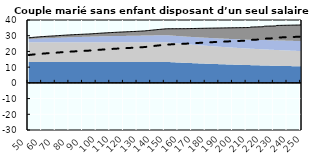
| Category | Coin fiscal moyen (somme des composantes) | Taux moyen d'imposition net en % du salaire brut |
|---|---|---|
| 50.0 | 28.675 | 17.719 |
| 51.0 | 28.762 | 17.82 |
| 52.0 | 28.845 | 17.916 |
| 53.0 | 28.926 | 18.009 |
| 54.0 | 29.004 | 18.098 |
| 55.0 | 29.078 | 18.185 |
| 56.0 | 29.15 | 18.268 |
| 57.0 | 29.22 | 18.348 |
| 58.0 | 29.287 | 18.426 |
| 59.0 | 29.352 | 18.5 |
| 60.0 | 29.415 | 18.573 |
| 61.0 | 29.475 | 18.643 |
| 62.0 | 29.534 | 18.71 |
| 63.0 | 29.591 | 18.776 |
| 64.0 | 29.646 | 18.839 |
| 65.0 | 29.699 | 18.901 |
| 66.0 | 29.751 | 18.961 |
| 67.0 | 29.801 | 19.019 |
| 68.0 | 29.85 | 19.075 |
| 69.0 | 29.897 | 19.129 |
| 70.0 | 29.946 | 19.186 |
| 71.0 | 30.009 | 19.258 |
| 72.0 | 30.07 | 19.329 |
| 73.0 | 30.13 | 19.398 |
| 74.0 | 30.188 | 19.465 |
| 75.0 | 30.245 | 19.53 |
| 76.0 | 30.3 | 19.594 |
| 77.0 | 30.353 | 19.655 |
| 78.0 | 30.405 | 19.716 |
| 79.0 | 30.456 | 19.774 |
| 80.0 | 30.506 | 19.831 |
| 81.0 | 30.554 | 19.887 |
| 82.0 | 30.601 | 19.942 |
| 83.0 | 30.647 | 19.995 |
| 84.0 | 30.692 | 20.047 |
| 85.0 | 30.736 | 20.097 |
| 86.0 | 30.779 | 20.147 |
| 87.0 | 30.821 | 20.195 |
| 88.0 | 30.862 | 20.242 |
| 89.0 | 30.902 | 20.288 |
| 90.0 | 30.941 | 20.334 |
| 91.0 | 30.979 | 20.378 |
| 92.0 | 31.017 | 20.421 |
| 93.0 | 31.053 | 20.463 |
| 94.0 | 31.089 | 20.505 |
| 95.0 | 31.133 | 20.555 |
| 96.0 | 31.197 | 20.629 |
| 97.0 | 31.26 | 20.701 |
| 98.0 | 31.322 | 20.773 |
| 99.0 | 31.382 | 20.843 |
| 100.0 | 31.442 | 20.911 |
| 101.0 | 31.5 | 20.978 |
| 102.0 | 31.557 | 21.044 |
| 103.0 | 31.613 | 21.109 |
| 104.0 | 31.668 | 21.172 |
| 105.0 | 31.722 | 21.234 |
| 106.0 | 31.775 | 21.295 |
| 107.0 | 31.827 | 21.355 |
| 108.0 | 31.877 | 21.414 |
| 109.0 | 31.927 | 21.471 |
| 110.0 | 31.977 | 21.528 |
| 111.0 | 32.025 | 21.584 |
| 112.0 | 32.072 | 21.638 |
| 113.0 | 32.118 | 21.692 |
| 114.0 | 32.164 | 21.745 |
| 115.0 | 32.209 | 21.796 |
| 116.0 | 32.253 | 21.847 |
| 117.0 | 32.296 | 21.897 |
| 118.0 | 32.339 | 21.946 |
| 119.0 | 32.381 | 21.995 |
| 120.0 | 32.422 | 22.042 |
| 121.0 | 32.463 | 22.089 |
| 122.0 | 32.503 | 22.135 |
| 123.0 | 32.542 | 22.18 |
| 124.0 | 32.58 | 22.225 |
| 125.0 | 32.618 | 22.268 |
| 126.0 | 32.656 | 22.312 |
| 127.0 | 32.692 | 22.354 |
| 128.0 | 32.729 | 22.396 |
| 129.0 | 32.777 | 22.452 |
| 130.0 | 32.825 | 22.507 |
| 131.0 | 32.873 | 22.563 |
| 132.0 | 32.92 | 22.617 |
| 133.0 | 32.966 | 22.67 |
| 134.0 | 33.012 | 22.723 |
| 135.0 | 33.057 | 22.775 |
| 136.0 | 33.146 | 22.878 |
| 137.0 | 33.238 | 22.984 |
| 138.0 | 33.329 | 23.088 |
| 139.0 | 33.419 | 23.192 |
| 140.0 | 33.507 | 23.293 |
| 141.0 | 33.594 | 23.394 |
| 142.0 | 33.679 | 23.493 |
| 143.0 | 33.764 | 23.59 |
| 144.0 | 33.847 | 23.686 |
| 145.0 | 33.929 | 23.781 |
| 146.0 | 34.01 | 23.874 |
| 147.0 | 34.09 | 23.967 |
| 148.0 | 34.169 | 24.058 |
| 149.0 | 34.247 | 24.147 |
| 150.0 | 34.324 | 24.236 |
| 151.0 | 34.4 | 24.323 |
| 152.0 | 34.428 | 24.382 |
| 153.0 | 34.432 | 24.426 |
| 154.0 | 34.436 | 24.469 |
| 155.0 | 34.44 | 24.511 |
| 156.0 | 34.444 | 24.553 |
| 157.0 | 34.447 | 24.595 |
| 158.0 | 34.451 | 24.636 |
| 159.0 | 34.455 | 24.676 |
| 160.0 | 34.459 | 24.716 |
| 161.0 | 34.462 | 24.756 |
| 162.0 | 34.466 | 24.794 |
| 163.0 | 34.469 | 24.833 |
| 164.0 | 34.473 | 24.871 |
| 165.0 | 34.478 | 24.91 |
| 166.0 | 34.497 | 24.965 |
| 167.0 | 34.516 | 25.02 |
| 168.0 | 34.536 | 25.074 |
| 169.0 | 34.554 | 25.128 |
| 170.0 | 34.573 | 25.181 |
| 171.0 | 34.591 | 25.233 |
| 172.0 | 34.61 | 25.284 |
| 173.0 | 34.628 | 25.335 |
| 174.0 | 34.645 | 25.386 |
| 175.0 | 34.663 | 25.436 |
| 176.0 | 34.68 | 25.485 |
| 177.0 | 34.698 | 25.534 |
| 178.0 | 34.715 | 25.582 |
| 179.0 | 34.732 | 25.629 |
| 180.0 | 34.748 | 25.676 |
| 181.0 | 34.765 | 25.723 |
| 182.0 | 34.781 | 25.769 |
| 183.0 | 34.798 | 25.815 |
| 184.0 | 34.814 | 25.86 |
| 185.0 | 34.83 | 25.904 |
| 186.0 | 34.845 | 25.948 |
| 187.0 | 34.861 | 25.992 |
| 188.0 | 34.876 | 26.035 |
| 189.0 | 34.892 | 26.078 |
| 190.0 | 34.907 | 26.12 |
| 191.0 | 34.922 | 26.162 |
| 192.0 | 34.936 | 26.203 |
| 193.0 | 34.951 | 26.244 |
| 194.0 | 34.966 | 26.285 |
| 195.0 | 34.98 | 26.325 |
| 196.0 | 34.994 | 26.365 |
| 197.0 | 35.008 | 26.404 |
| 198.0 | 35.022 | 26.443 |
| 199.0 | 35.036 | 26.481 |
| 200.0 | 35.05 | 26.52 |
| 201.0 | 35.064 | 26.557 |
| 202.0 | 35.077 | 26.595 |
| 203.0 | 35.09 | 26.632 |
| 204.0 | 35.104 | 26.668 |
| 205.0 | 35.117 | 26.705 |
| 206.0 | 35.13 | 26.741 |
| 207.0 | 35.143 | 26.776 |
| 208.0 | 35.155 | 26.811 |
| 209.0 | 35.168 | 26.846 |
| 210.0 | 35.18 | 26.881 |
| 211.0 | 35.193 | 26.915 |
| 212.0 | 35.205 | 26.949 |
| 213.0 | 35.515 | 27.318 |
| 214.0 | 35.538 | 27.363 |
| 215.0 | 35.56 | 27.408 |
| 216.0 | 35.583 | 27.453 |
| 217.0 | 35.605 | 27.497 |
| 218.0 | 35.627 | 27.54 |
| 219.0 | 35.649 | 27.583 |
| 220.0 | 35.67 | 27.626 |
| 221.0 | 35.692 | 27.669 |
| 222.0 | 35.713 | 27.711 |
| 223.0 | 36.056 | 28.114 |
| 224.0 | 36.075 | 28.154 |
| 225.0 | 36.094 | 28.193 |
| 226.0 | 36.114 | 28.232 |
| 227.0 | 36.133 | 28.271 |
| 228.0 | 36.152 | 28.309 |
| 229.0 | 36.17 | 28.347 |
| 230.0 | 36.189 | 28.385 |
| 231.0 | 36.207 | 28.422 |
| 232.0 | 36.535 | 28.806 |
| 233.0 | 36.552 | 28.841 |
| 234.0 | 36.569 | 28.876 |
| 235.0 | 36.586 | 28.911 |
| 236.0 | 36.602 | 28.945 |
| 237.0 | 36.619 | 28.979 |
| 238.0 | 36.635 | 29.013 |
| 239.0 | 36.651 | 29.046 |
| 240.0 | 36.667 | 29.08 |
| 241.0 | 36.683 | 29.113 |
| 242.0 | 36.698 | 29.145 |
| 243.0 | 36.714 | 29.177 |
| 244.0 | 36.729 | 29.21 |
| 245.0 | 36.745 | 29.241 |
| 246.0 | 36.76 | 29.273 |
| 247.0 | 36.775 | 29.304 |
| 248.0 | 36.79 | 29.335 |
| 249.0 | 36.812 | 29.374 |
| 250.0 | 36.861 | 29.443 |